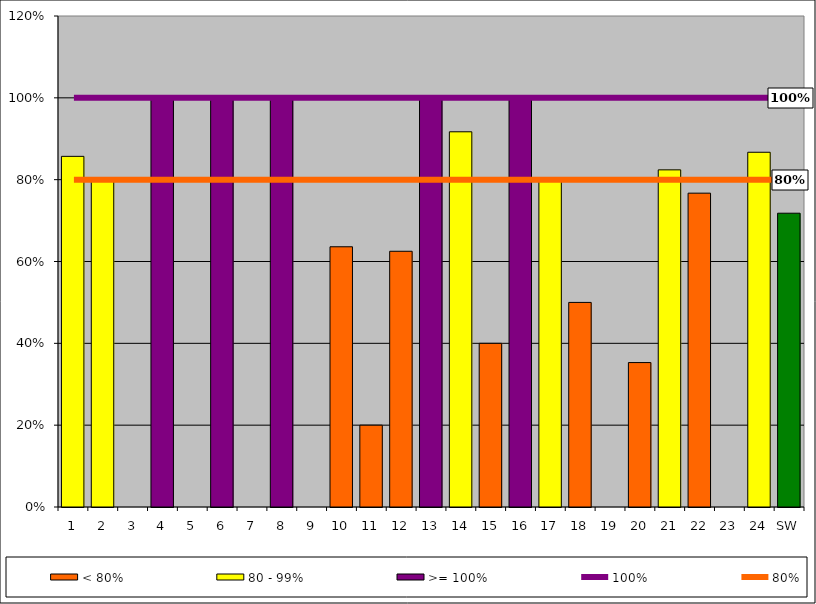
| Category | < 80% | 80 - 99% | >= 100% |
|---|---|---|---|
| 1 | 0 | 0.857 | 0 |
| 2 | 0 | 0.8 | 0 |
| 3 | 0 | 0 | 0 |
| 4 | 0 | 0 | 1 |
| 5 | 0 | 0 | 0 |
| 6 | 0 | 0 | 1 |
| 7 | 0 | 0 | 0 |
| 8 | 0 | 0 | 1 |
| 9 | 0 | 0 | 0 |
| 10 | 0.636 | 0 | 0 |
| 11 | 0.2 | 0 | 0 |
| 12 | 0.625 | 0 | 0 |
| 13 | 0 | 0 | 1 |
| 14 | 0 | 0.917 | 0 |
| 15 | 0.4 | 0 | 0 |
| 16 | 0 | 0 | 1 |
| 17 | 0 | 0.8 | 0 |
| 18 | 0.5 | 0 | 0 |
| 19 | 0 | 0 | 0 |
| 20 | 0.353 | 0 | 0 |
| 21 | 0 | 0.824 | 0 |
| 22 | 0.767 | 0 | 0 |
| 23 | 0 | 0 | 0 |
| 24 | 0 | 0.867 | 0 |
| SW | 0.718 | 0 | 0 |